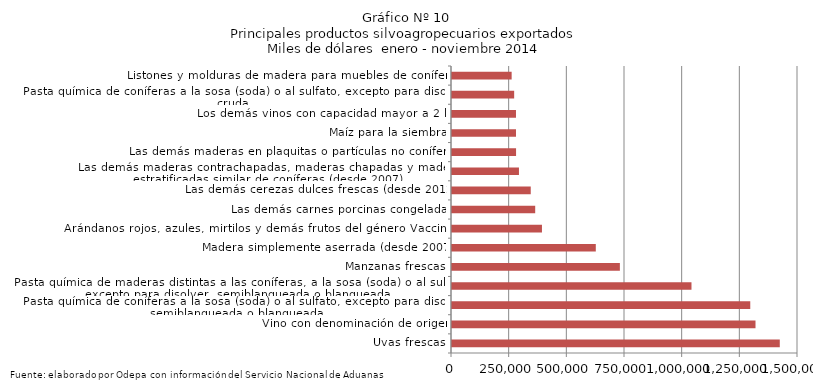
| Category | Series 0 |
|---|---|
| Uvas frescas | 1421027.714 |
| Vino con denominación de origen | 1315771.9 |
| Pasta química de coníferas a la sosa (soda) o al sulfato, excepto para disolver, semiblanqueada o blanqueada | 1293055.934 |
| Pasta química de maderas distintas a las coníferas, a la sosa (soda) o al sulfato, excepto para disolver, semiblanqueada o blanqueada | 1038211.638 |
| Manzanas frescas | 727780.596 |
| Madera simplemente aserrada (desde 2007) | 623409.3 |
| Arándanos rojos, azules, mirtilos y demás frutos del género Vaccinium | 389994.496 |
| Las demás carnes porcinas congeladas | 360694.799 |
| Las demás cerezas dulces frescas (desde 2012) | 341376.452 |
| Las demás maderas contrachapadas, maderas chapadas y maderas estratificadas similar de coníferas (desde 2007) | 290269.366 |
| Las demás maderas en plaquitas o partículas no coníferas | 277732.322 |
| Maíz para la siembra | 277411.002 |
| Los demás vinos con capacidad mayor a 2 lts | 277395.742 |
| Pasta química de coníferas a la sosa (soda) o al sulfato, excepto para disolver, cruda | 269509.824 |
| Listones y molduras de madera para muebles de coníferas | 258576.542 |